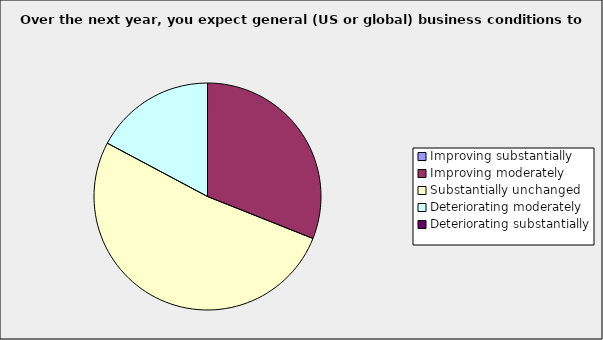
| Category | Series 0 |
|---|---|
| Improving substantially | 0 |
| Improving moderately | 0.31 |
| Substantially unchanged | 0.517 |
| Deteriorating moderately | 0.172 |
| Deteriorating substantially | 0 |